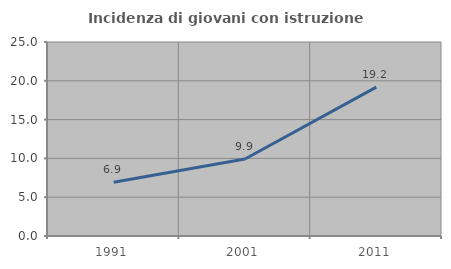
| Category | Incidenza di giovani con istruzione universitaria |
|---|---|
| 1991.0 | 6.933 |
| 2001.0 | 9.93 |
| 2011.0 | 19.183 |